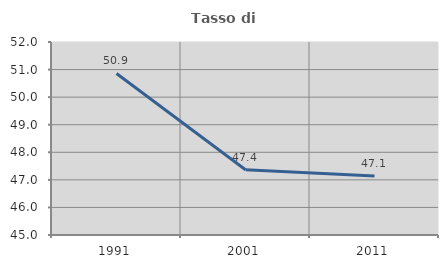
| Category | Tasso di occupazione   |
|---|---|
| 1991.0 | 50.859 |
| 2001.0 | 47.365 |
| 2011.0 | 47.141 |